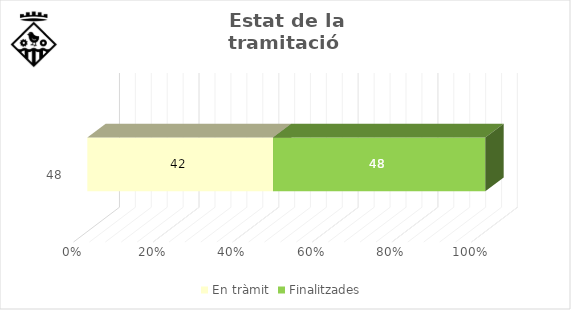
| Category | En tràmit | Finalitzades  |
|---|---|---|
| 48.0 | 42 | 48 |